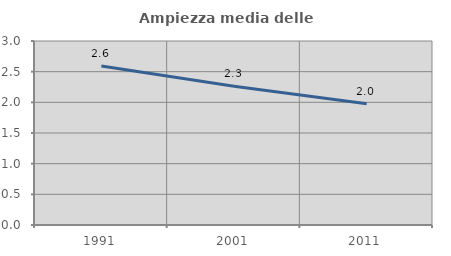
| Category | Ampiezza media delle famiglie |
|---|---|
| 1991.0 | 2.593 |
| 2001.0 | 2.262 |
| 2011.0 | 1.976 |